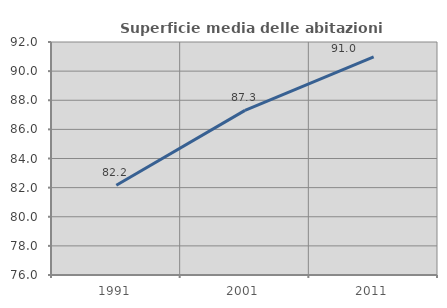
| Category | Superficie media delle abitazioni occupate |
|---|---|
| 1991.0 | 82.168 |
| 2001.0 | 87.306 |
| 2011.0 | 90.981 |